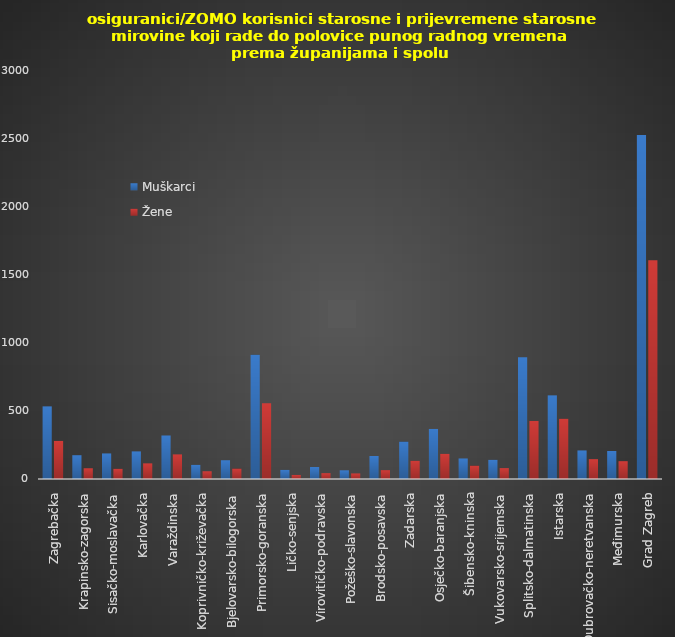
| Category | Muškarci | Žene |
|---|---|---|
| Zagrebačka | 534 | 280 |
| Krapinsko-zagorska | 175 | 79 |
| Sisačko-moslavačka | 188 | 75 |
| Karlovačka | 203 | 115 |
| Varaždinska | 320 | 181 |
| Koprivničko-križevačka | 104 | 57 |
| Bjelovarsko-bilogorska | 138 | 77 |
| Primorsko-goranska | 914 | 557 |
| Ličko-senjska | 67 | 30 |
| Virovitičko-podravska | 88 | 43 |
| Požeško-slavonska | 64 | 41 |
| Brodsko-posavska | 169 | 65 |
| Zadarska | 275 | 134 |
| Osječko-baranjska | 368 | 185 |
| Šibensko-kninska | 151 | 98 |
| Vukovarsko-srijemska | 141 | 80 |
| Splitsko-dalmatinska | 896 | 427 |
| Istarska | 615 | 443 |
| Dubrovačko-neretvanska | 210 | 146 |
| Međimurska | 206 | 131 |
| Grad Zagreb | 2530 | 1608 |